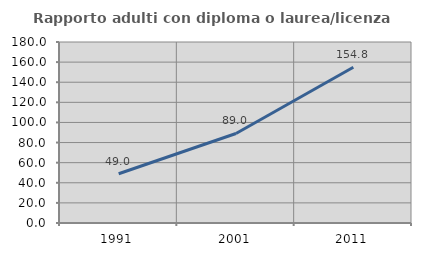
| Category | Rapporto adulti con diploma o laurea/licenza media  |
|---|---|
| 1991.0 | 48.98 |
| 2001.0 | 89.041 |
| 2011.0 | 154.839 |